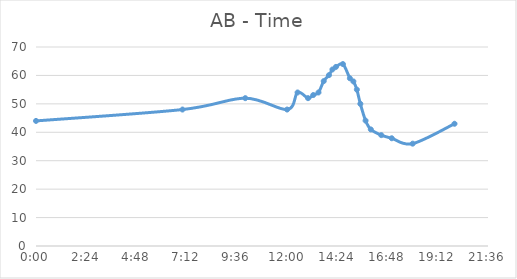
| Category | AB |
|---|---|
| 0.0 | 44 |
| 0.2916666666666667 | 48 |
| 0.4166666666666667 | 52 |
| 0.5 | 48 |
| 0.5208333333333334 | 54 |
| 0.5416666666666666 | 52 |
| 0.5520833333333334 | 53.1 |
| 0.5625 | 54 |
| 0.5729166666666666 | 58 |
| 0.5833333333333334 | 60.1 |
| 0.5902777777777778 | 62.1 |
| 0.5972222222222222 | 63 |
| 0.611111111111111 | 64 |
| 0.625 | 59 |
| 0.6319444444444444 | 57.9 |
| 0.638888888888889 | 55 |
| 0.6458333333333334 | 50 |
| 0.65625 | 44.1 |
| 0.6666666666666666 | 41 |
| 0.6875 | 39 |
| 0.7083333333333334 | 37.9 |
| 0.75 | 36 |
| 0.8333333333333334 | 43 |